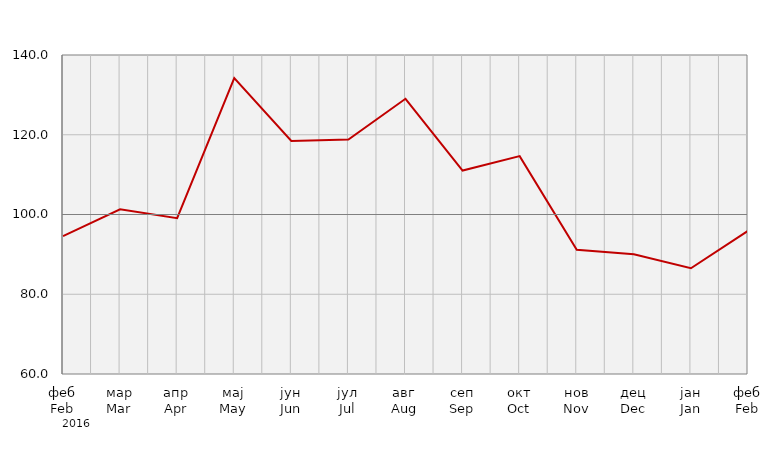
| Category | Индекси ноћења туриста
Tourist night indices |
|---|---|
| феб
Feb | 94.599 |
| мар
Mar | 101.315 |
| апр
Apr | 99.062 |
| мај
May | 134.186 |
| јун
Jun | 118.44 |
| јул
Jul | 118.819 |
| авг
Aug | 129.021 |
| сеп
Sep | 111.019 |
| окт
Oct | 114.634 |
| нов
Nov | 91.14 |
| дец
Dec | 90.034 |
| јан
Jan | 86.514 |
| феб
Feb | 95.907 |